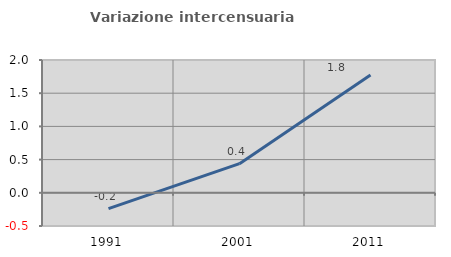
| Category | Variazione intercensuaria annua |
|---|---|
| 1991.0 | -0.239 |
| 2001.0 | 0.438 |
| 2011.0 | 1.776 |